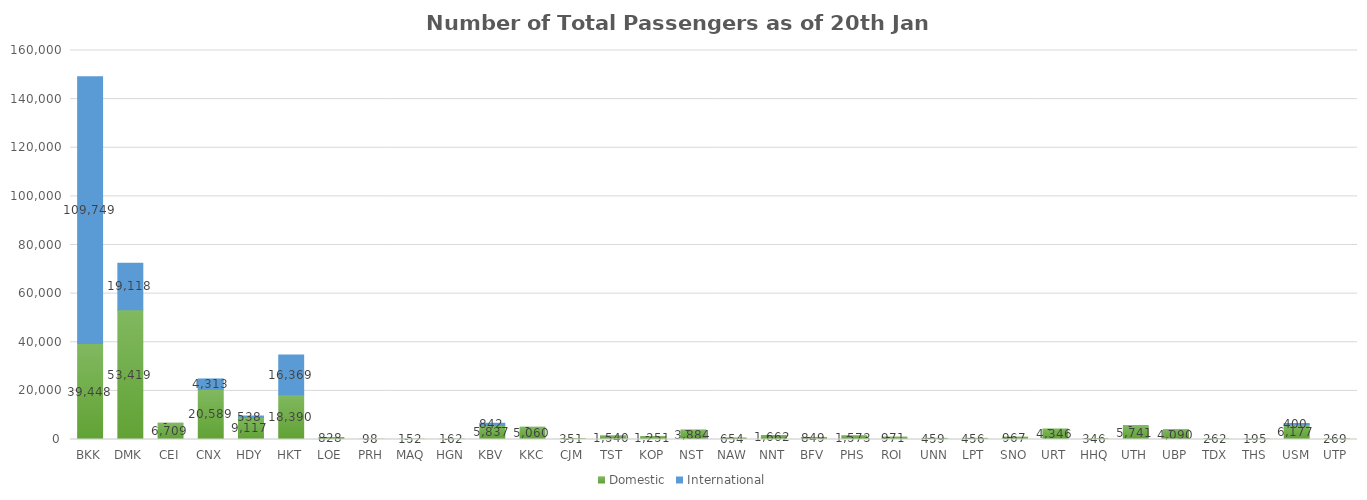
| Category | Domestic | International |
|---|---|---|
| BKK | 39448 | 109749 |
| DMK | 53419 | 19118 |
| CEI | 6709 | 0 |
| CNX | 20589 | 4313 |
| HDY | 9117 | 538 |
| HKT | 18390 | 16369 |
| LOE | 828 | 0 |
| PRH | 98 | 0 |
| MAQ | 152 | 0 |
| HGN | 162 | 0 |
| KBV | 5837 | 842 |
| KKC | 5060 | 0 |
| CJM | 351 | 0 |
| TST | 1540 | 0 |
| KOP | 1251 | 0 |
| NST | 3884 | 0 |
| NAW | 654 | 0 |
| NNT | 1662 | 0 |
| BFV | 849 | 0 |
| PHS | 1573 | 0 |
| ROI | 971 | 0 |
| UNN | 459 | 0 |
| LPT | 456 | 0 |
| SNO | 967 | 0 |
| URT | 4346 | 0 |
| HHQ | 346 | 0 |
| UTH | 5741 | 0 |
| UBP | 4090 | 0 |
| TDX | 262 | 0 |
| THS | 195 | 0 |
| USM | 6177 | 400 |
| UTP | 269 | 0 |